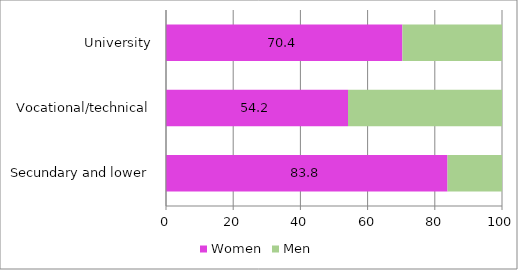
| Category | Women | Men |
|---|---|---|
| Secundary and lower | 83.784 | 16.216 |
| Vocational/technical | 54.167 | 45.833 |
| University | 70.358 | 29.642 |